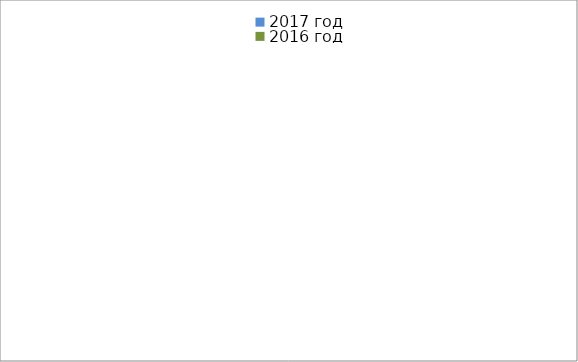
| Category | 2017 год | 2016 год |
|---|---|---|
|  - поджог | 7 | 10 |
|  - неосторожное обращение с огнём | 4 | 3 |
|  - НПТЭ электрооборудования | 14 | 13 |
|  - НПУ и Э печей | 47 | 30 |
|  - НПУ и Э транспортных средств | 31 | 35 |
|   -Шалость с огнем детей | 3 | 3 |
|  -НППБ при эксплуатации эл.приборов | 12 | 19 |
|  - курение | 16 | 20 |
| - прочие | 41 | 46 |
| - не установленные причины | 0 | 0 |